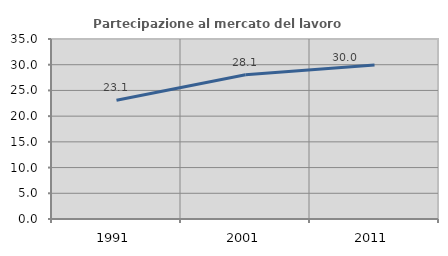
| Category | Partecipazione al mercato del lavoro  femminile |
|---|---|
| 1991.0 | 23.089 |
| 2001.0 | 28.064 |
| 2011.0 | 29.959 |